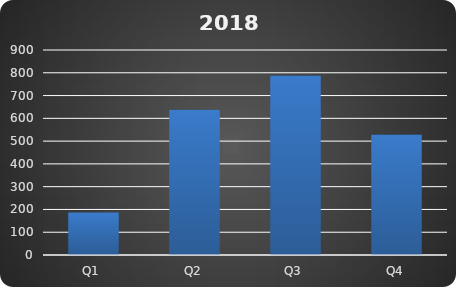
| Category | 2018 | Max |
|---|---|---|
| Q1 | 187 | 857 |
| Q2 | 638 | 857 |
| Q3 | 788 | 857 |
| Q4 | 529 | 857 |